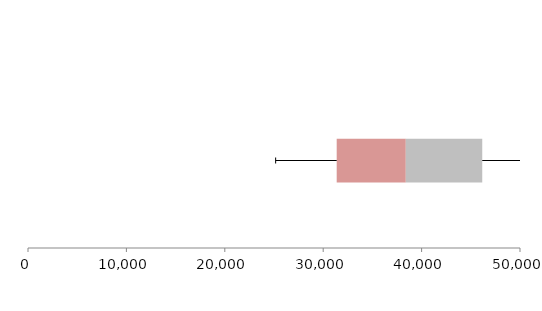
| Category | Series 1 | Series 2 | Series 3 |
|---|---|---|---|
| 0 | 31371.505 | 7022.862 | 7768.45 |